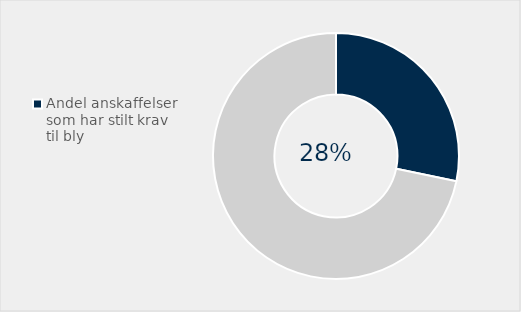
| Category | Series 0 |
|---|---|
| Andel anskaffelser som har stilt krav til bly | 0.283 |
| Ikke stilt krav | 0.717 |